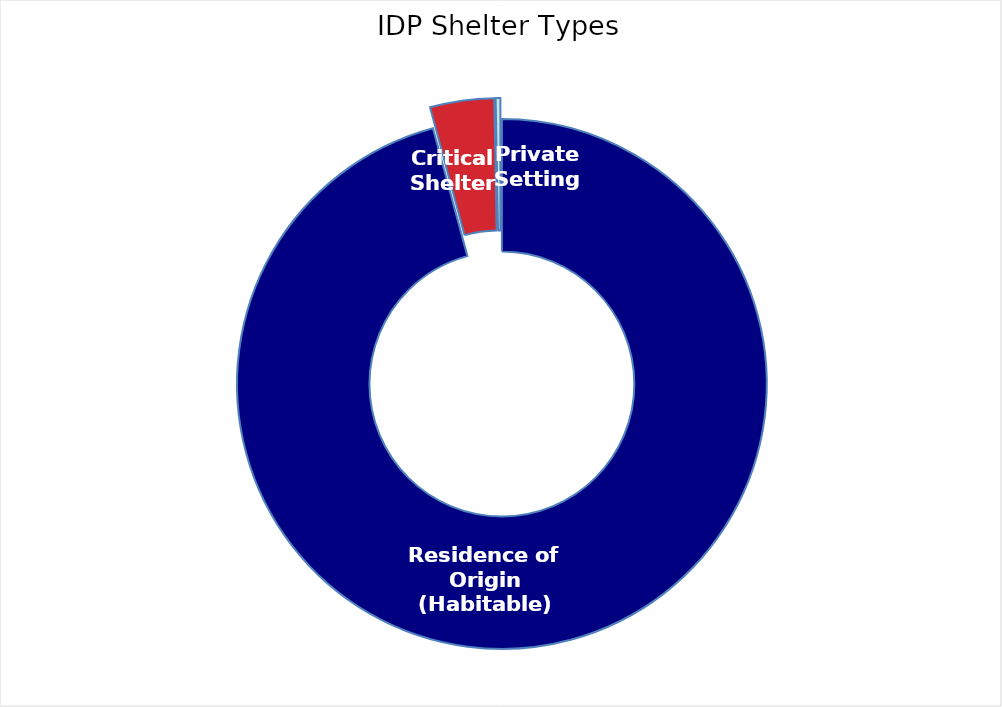
| Category | Individuals |
|---|---|
| Residence of Origin (Habitable) | 4732014 |
| Critical Shelter | 192912 |
| Private Setting | 14148 |